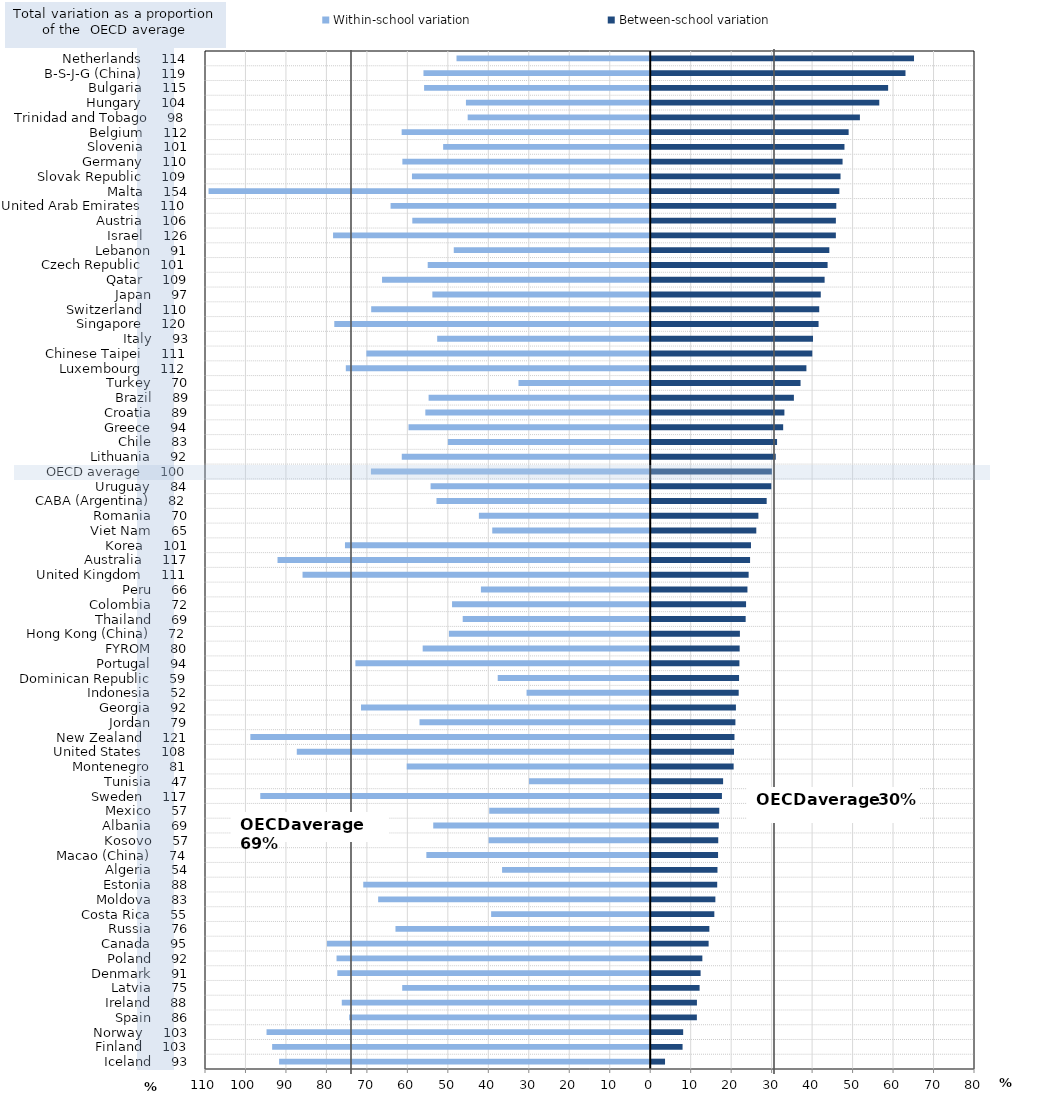
| Category | Within-school variation | Between-school variation |
|---|---|---|
| Iceland     93 | -91.695 | 3.662 |
| Finland     103 | -93.412 | 7.994 |
| Norway     103 | -94.797 | 8.143 |
| Spain     86 | -74.37 | 11.528 |
| Ireland     88 | -76.205 | 11.543 |
| Latvia     75 | -61.275 | 12.205 |
| Denmark     91 | -77.311 | 12.449 |
| Poland     92 | -77.496 | 12.883 |
| Canada     95 | -79.87 | 14.434 |
| Russia     76 | -62.939 | 14.617 |
| Costa Rica     55 | -39.306 | 15.843 |
| Moldova     83 | -67.22 | 16.101 |
| Estonia     88 | -70.9 | 16.554 |
| Algeria     54 | -36.601 | 16.62 |
| Macao (China)     74 | -55.308 | 16.765 |
| Kosovo     57 | -39.925 | 16.81 |
| Albania     69 | -53.608 | 16.959 |
| Mexico     57 | -39.774 | 17.072 |
| Sweden     117 | -96.343 | 17.719 |
| Tunisia     47 | -29.942 | 18.01 |
| Montenegro     81 | -60.162 | 20.616 |
| United States     108 | -87.321 | 20.706 |
| New Zealand     121 | -98.793 | 20.818 |
| Jordan     79 | -57.001 | 21.052 |
| Georgia     92 | -71.453 | 21.18 |
| Indonesia     52 | -30.55 | 21.865 |
| Dominican Republic     59 | -37.677 | 21.952 |
| Portugal     94 | -72.844 | 22.042 |
| FYROM     80 | -56.217 | 22.106 |
| Hong Kong (China)     72 | -49.736 | 22.162 |
| Thailand     69 | -46.327 | 23.586 |
| Colombia     72 | -48.963 | 23.682 |
| Peru     66 | -41.824 | 24.024 |
| United Kingdom     111 | -85.901 | 24.32 |
| Australia     117 | -92.084 | 24.671 |
| Korea     101 | -75.416 | 24.898 |
| Viet Nam     65 | -39.029 | 26.211 |
| Romania     70 | -42.33 | 26.729 |
| CABA (Argentina)     82 | -52.809 | 28.776 |
| Uruguay     84 | -54.266 | 29.921 |
| OECD average     100 | -68.997 | 30.059 |
| Lithuania     92 | -61.382 | 31.023 |
| Chile     83 | -49.996 | 31.341 |
| Greece     94 | -59.718 | 32.851 |
| Croatia     89 | -55.561 | 33.155 |
| Brazil     89 | -54.754 | 35.502 |
| Turkey     70 | -32.545 | 37.146 |
| Luxembourg     112 | -75.207 | 38.592 |
| Chinese Taipei     111 | -70.128 | 40.048 |
| Italy     93 | -52.635 | 40.223 |
| Singapore     120 | -78.055 | 41.597 |
| Switzerland     110 | -68.94 | 41.759 |
| Japan     97 | -53.826 | 42.142 |
| Qatar     109 | -66.259 | 43.092 |
| Czech Republic     101 | -54.973 | 43.827 |
| Lebanon     91 | -48.535 | 44.256 |
| Israel     126 | -78.359 | 45.872 |
| Austria     106 | -58.782 | 45.874 |
| United Arab Emirates     110 | -64.151 | 45.978 |
| Malta     154 | -109.125 | 46.734 |
| Slovak Republic     109 | -58.864 | 47.024 |
| Germany     110 | -61.235 | 47.527 |
| Slovenia     101 | -51.16 | 47.996 |
| Belgium     112 | -61.411 | 49.026 |
| Trinidad and Tobago     98 | -45.1 | 51.811 |
| Hungary     104 | -45.529 | 56.599 |
| Bulgaria     115 | -55.866 | 58.782 |
| B-S-J-G (China)     119 | -56.022 | 63.072 |
| Netherlands     114 | -47.858 | 65.18 |